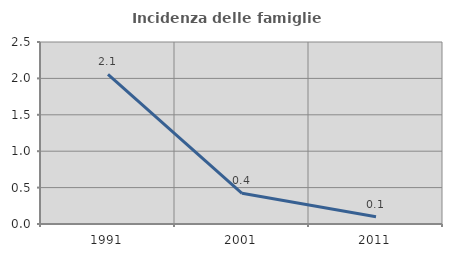
| Category | Incidenza delle famiglie numerose |
|---|---|
| 1991.0 | 2.055 |
| 2001.0 | 0.421 |
| 2011.0 | 0.101 |